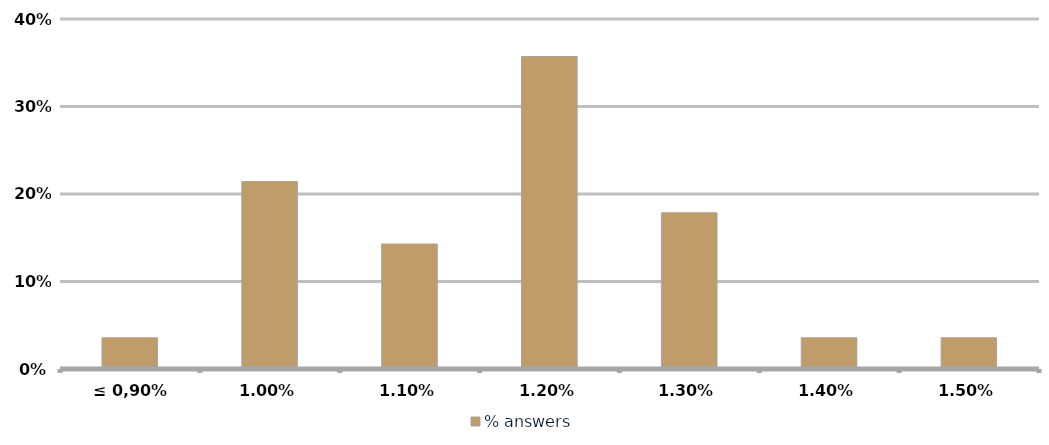
| Category | % answers |
|---|---|
| ≤ 0,90% | 0.036 |
| 1,00% | 0.214 |
| 1,10% | 0.143 |
| 1,20% | 0.357 |
| 1,30% | 0.179 |
| 1,40% | 0.036 |
| 1,50% | 0.036 |